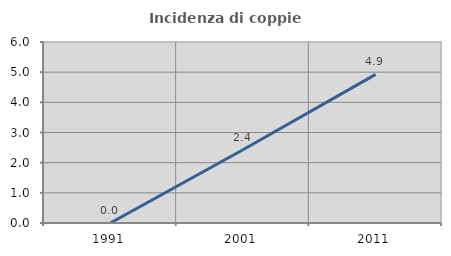
| Category | Incidenza di coppie miste |
|---|---|
| 1991.0 | 0 |
| 2001.0 | 2.427 |
| 2011.0 | 4.926 |